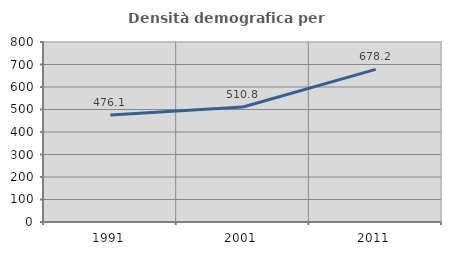
| Category | Densità demografica |
|---|---|
| 1991.0 | 476.09 |
| 2001.0 | 510.841 |
| 2011.0 | 678.183 |